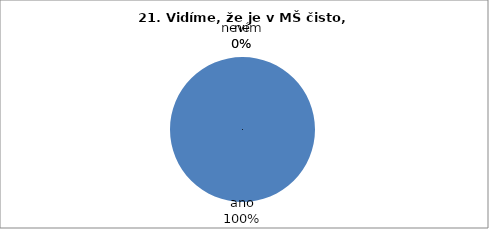
| Category | 21. |
|---|---|
| ano | 34 |
| ne | 0 |
| nevím | 0 |